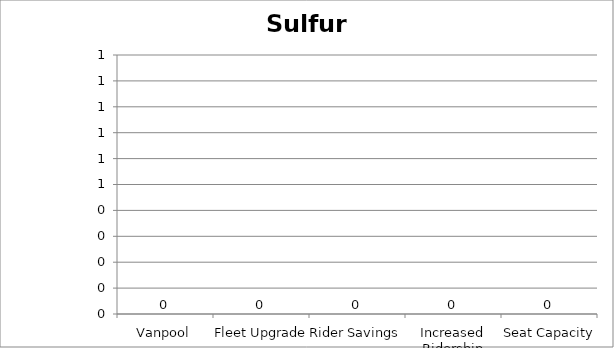
| Category | Sulfur Oxides |
|---|---|
| Vanpool | 0 |
| Fleet Upgrade | 0 |
| Rider Savings | 0 |
| Increased Ridership | 0 |
| Seat Capacity | 0 |